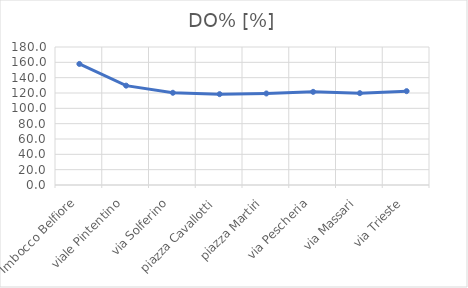
| Category | DO% [%] |
|---|---|
| Imbocco Belfiore | 157.9 |
| viale Pintentino | 129.6 |
| via Solferino | 120.3 |
| piazza Cavallotti | 118.5 |
| piazza Martiri | 119.4 |
| via Pescheria | 121.5 |
| via Massari | 119.8 |
| via Trieste | 122.4 |